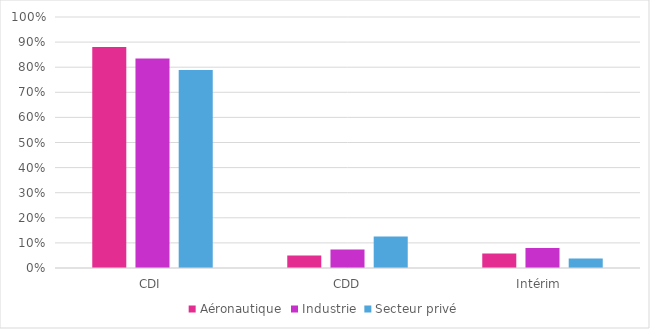
| Category | Aéronautique | Industrie | Secteur privé |
|---|---|---|---|
| CDI | 0.881 | 0.835 | 0.789 |
| CDD | 0.049 | 0.074 | 0.126 |
| Intérim  | 0.058 | 0.079 | 0.038 |